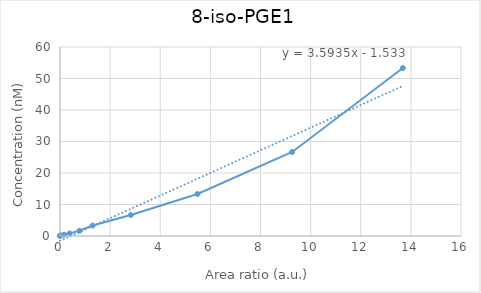
| Category | 8-iso-PGE1 |
|---|---|
| 0.0 | 0 |
| 0.0111587890583207 | 0.208 |
| 0.160710693649724 | 0.417 |
| 0.384484461245426 | 0.833 |
| 0.778268323790477 | 1.667 |
| 1.30175126627881 | 3.333 |
| 2.8255892222367 | 6.667 |
| 5.48584589668255 | 13.333 |
| 9.26309475960123 | 26.667 |
| 13.6801729186908 | 53.333 |